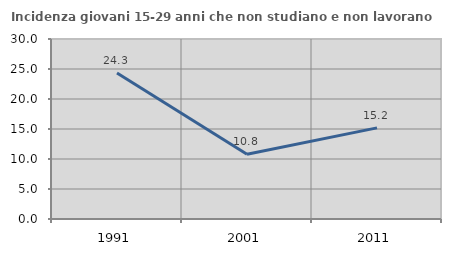
| Category | Incidenza giovani 15-29 anni che non studiano e non lavorano  |
|---|---|
| 1991.0 | 24.317 |
| 2001.0 | 10.806 |
| 2011.0 | 15.186 |